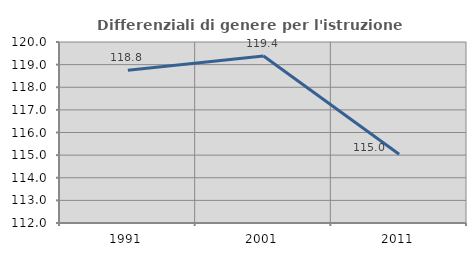
| Category | Differenziali di genere per l'istruzione superiore |
|---|---|
| 1991.0 | 118.754 |
| 2001.0 | 119.383 |
| 2011.0 | 115.04 |